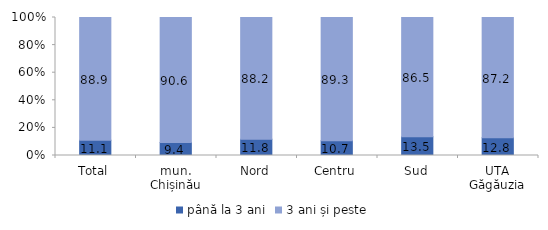
| Category | până la 3 ani | 3 ani și peste |
|---|---|---|
| Total | 11.1 | 88.9 |
| mun. Chișinău | 9.4 | 90.6 |
| Nord | 11.8 | 88.2 |
| Centru | 10.7 | 89.3 |
| Sud | 13.5 | 86.5 |
| UTA Găgăuzia | 12.8 | 87.2 |